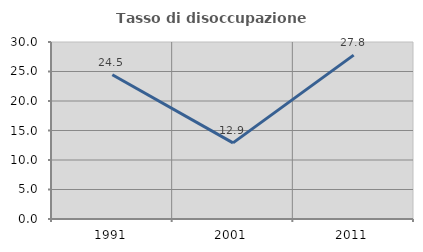
| Category | Tasso di disoccupazione giovanile  |
|---|---|
| 1991.0 | 24.455 |
| 2001.0 | 12.903 |
| 2011.0 | 27.778 |